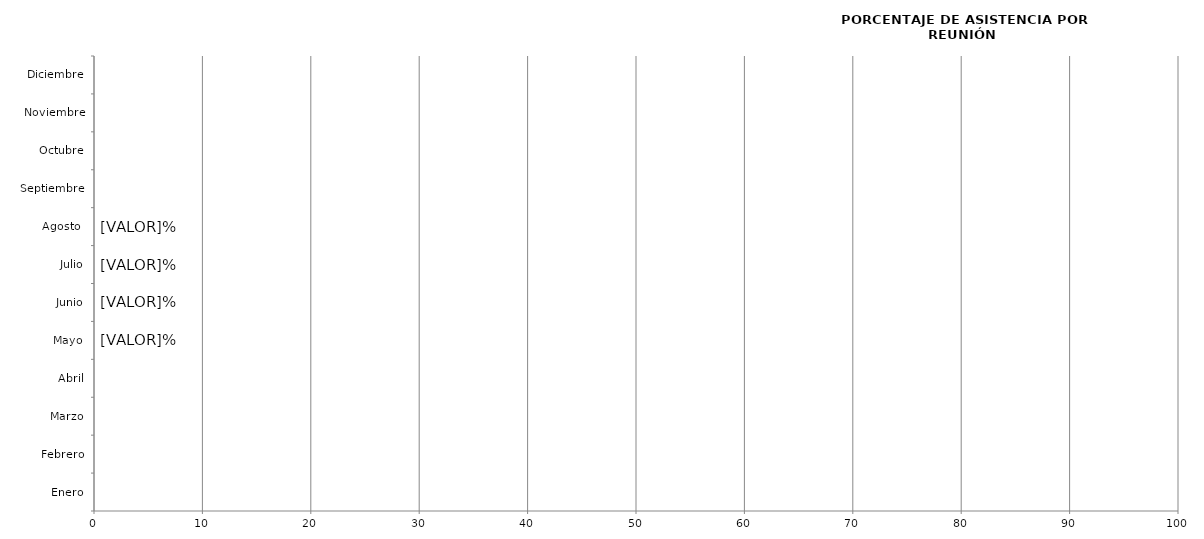
| Category | Series 0 |
|---|---|
| Enero | 0 |
| Febrero | 0 |
| Marzo | 0 |
| Abril | 0 |
| Mayo | 0 |
| Junio | 0 |
| Julio | 0 |
| Agosto  | 0 |
| Septiembre | 0 |
| Octubre | 0 |
| Noviembre | 0 |
| Diciembre | 0 |